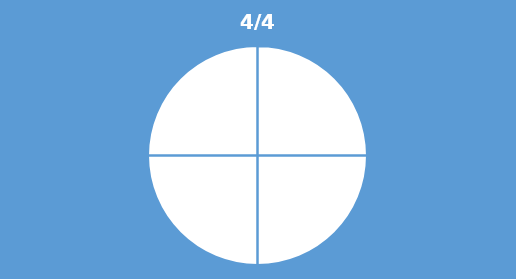
| Category | Series 0 |
|---|---|
| 0 | 0.25 |
| 1 | 0.25 |
| 2 | 0.25 |
| 3 | 0.25 |